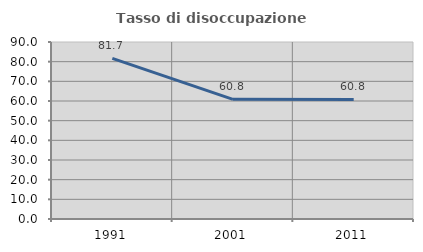
| Category | Tasso di disoccupazione giovanile  |
|---|---|
| 1991.0 | 81.659 |
| 2001.0 | 60.833 |
| 2011.0 | 60.784 |